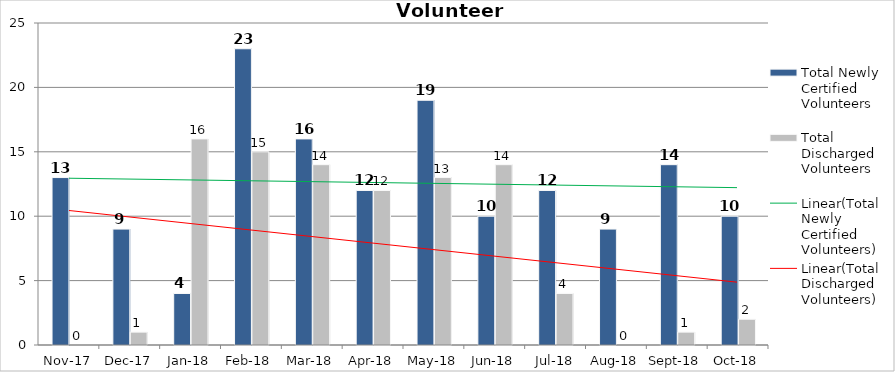
| Category | Total Newly Certified Volunteers | Total Discharged Volunteers |
|---|---|---|
| 2017-11-01 | 13 | 0 |
| 2017-12-01 | 9 | 1 |
| 2018-01-01 | 4 | 16 |
| 2018-02-01 | 23 | 15 |
| 2018-03-01 | 16 | 14 |
| 2018-04-01 | 12 | 12 |
| 2018-05-01 | 19 | 13 |
| 2018-06-01 | 10 | 14 |
| 2018-07-01 | 12 | 4 |
| 2018-08-01 | 9 | 0 |
| 2018-09-01 | 14 | 1 |
| 2018-10-01 | 10 | 2 |